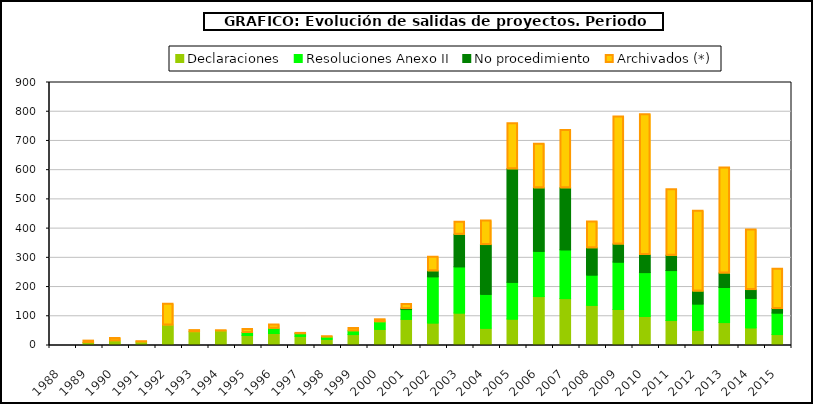
| Category | Declaraciones | Resoluciones Anexo II | No procedimiento | Archivados (*) |
|---|---|---|---|---|
| 1988.0 | 0 | 0 | 0 | 0 |
| 1989.0 | 7 | 0 | 0 | 8 |
| 1990.0 | 13 | 0 | 0 | 11 |
| 1991.0 | 9 | 0 | 0 | 4 |
| 1992.0 | 67 | 0 | 0 | 74 |
| 1993.0 | 44 | 0 | 0 | 7 |
| 1994.0 | 47 | 0 | 0 | 3 |
| 1995.0 | 31 | 10 | 0 | 14 |
| 1996.0 | 38 | 18 | 0 | 14 |
| 1997.0 | 28 | 10 | 0 | 2 |
| 1998.0 | 18 | 8 | 0 | 4 |
| 1999.0 | 34 | 13 | 0 | 11 |
| 2000.0 | 52 | 26 | 0 | 10 |
| 2001.0 | 86 | 35 | 2 | 17 |
| 2002.0 | 74 | 158 | 20 | 50 |
| 2003.0 | 108 | 158 | 111 | 45 |
| 2004.0 | 56 | 116 | 170 | 84 |
| 2005.0 | 87 | 126 | 388 | 158 |
| 2006.0 | 164 | 155 | 217 | 153 |
| 2007.0 | 157 | 167 | 212 | 200 |
| 2008.0 | 134 | 104 | 93 | 92 |
| 2009.0 | 120 | 162 | 62 | 438 |
| 2010.0 | 96 | 150 | 62 | 482 |
| 2011.0 | 82 | 171 | 52 | 228 |
| 2012.0 | 49 | 90 | 44 | 276 |
| 2013.0 | 75 | 120 | 50 | 362 |
| 2014.0 | 57 | 101 | 30 | 207 |
| 2015.0 | 34 | 74 | 15 | 138 |